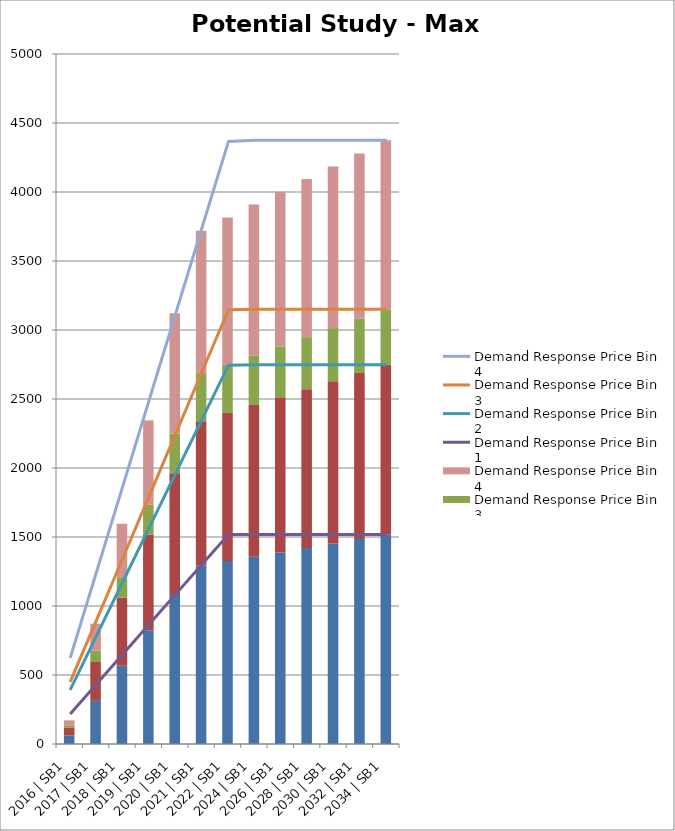
| Category | Demand Response Price Bin 1 | Demand Response Price Bin 2 | Demand Response Price Bin 3 | Demand Response Price Bin 4 |
|---|---|---|---|---|
| 2016 | SB1 | 62.138 | 57.842 | 16.12 | 35.244 |
| 2017 | SB1 | 312.583 | 281.787 | 81.554 | 195.507 |
| 2018 | SB1 | 566.777 | 493.39 | 148.577 | 387.475 |
| 2019 | SB1 | 824.412 | 691.759 | 217.12 | 612.273 |
| 2020 | SB1 | 1086.097 | 876.229 | 287.271 | 871.031 |
| 2021 | SB1 | 1294.07 | 1044.693 | 342.375 | 1038.757 |
| 2022 | SB1 | 1325.906 | 1072 | 351.023 | 1066.527 |
| 2024 | SB1 | 1357.33 | 1098.917 | 359.554 | 1093.889 |
| 2026 | SB1 | 1387.857 | 1125.194 | 367.859 | 1120.645 |
| 2028 | SB1 | 1420.271 | 1151.154 | 376.406 | 1146.378 |
| 2030 | SB1 | 1452.219 | 1176.786 | 384.836 | 1171.802 |
| 2032 | SB1 | 1484.887 | 1202.988 | 393.455 | 1197.79 |
| 2034 | SB1 | 1518.289 | 1229.774 | 402.267 | 1224.354 |